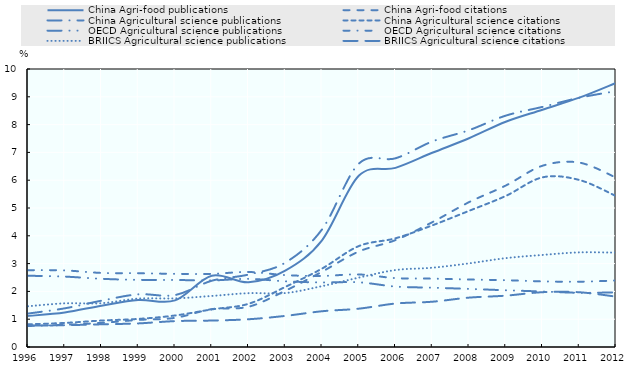
| Category | China Agri-food publications | China Agri-food citations | China Agricultural science publications | China Agricultural science citations | OECD Agricultural science publications | OECD Agricultural science citations | BRIICS Agricultural science publications | BRIICS Agricultural science citations |
|---|---|---|---|---|---|---|---|---|
| 1996.0 | 1.117 | 0.756 | 1.202 | 0.816 | 2.563 | 2.765 | 1.465 | 0.769 |
| 1997.0 | 1.242 | 0.797 | 1.391 | 0.866 | 2.533 | 2.754 | 1.57 | 0.783 |
| 1998.0 | 1.487 | 0.867 | 1.666 | 0.951 | 2.453 | 2.664 | 1.575 | 0.816 |
| 1999.0 | 1.692 | 0.973 | 1.895 | 1.01 | 2.415 | 2.654 | 1.741 | 0.848 |
| 2000.0 | 1.676 | 1.049 | 1.869 | 1.133 | 2.411 | 2.632 | 1.748 | 0.931 |
| 2001.0 | 2.565 | 1.362 | 2.383 | 1.352 | 2.395 | 2.631 | 1.836 | 0.951 |
| 2002.0 | 2.328 | 1.448 | 2.606 | 1.554 | 2.451 | 2.698 | 1.936 | 0.998 |
| 2003.0 | 2.746 | 2.022 | 3.033 | 2.16 | 2.363 | 2.586 | 1.941 | 1.118 |
| 2004.0 | 3.839 | 2.708 | 4.229 | 2.82 | 2.322 | 2.556 | 2.189 | 1.286 |
| 2005.0 | 6.158 | 3.434 | 6.592 | 3.629 | 2.327 | 2.61 | 2.495 | 1.378 |
| 2006.0 | 6.443 | 3.845 | 6.788 | 3.911 | 2.174 | 2.478 | 2.768 | 1.564 |
| 2007.0 | 6.986 | 4.489 | 7.393 | 4.375 | 2.133 | 2.46 | 2.852 | 1.629 |
| 2008.0 | 7.509 | 5.209 | 7.799 | 4.897 | 2.09 | 2.427 | 3.008 | 1.776 |
| 2009.0 | 8.103 | 5.807 | 8.322 | 5.433 | 2.041 | 2.403 | 3.196 | 1.847 |
| 2010.0 | 8.536 | 6.52 | 8.637 | 6.102 | 1.996 | 2.361 | 3.311 | 1.972 |
| 2011.0 | 8.968 | 6.633 | 8.965 | 6.009 | 1.951 | 2.349 | 3.404 | 1.97 |
| 2012.0 | 9.499 | 6.094 | 9.205 | 5.43 | 1.964 | 2.392 | 3.395 | 1.812 |